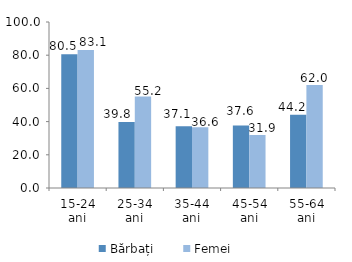
| Category | Bărbați | Femei |
|---|---|---|
| 15-24 ani | 80.505 | 83.131 |
| 25-34 ani | 39.809 | 55.189 |
| 35-44 ani | 37.133 | 36.599 |
| 45-54 ani | 37.616 | 31.917 |
| 55-64 ani | 44.193 | 61.99 |